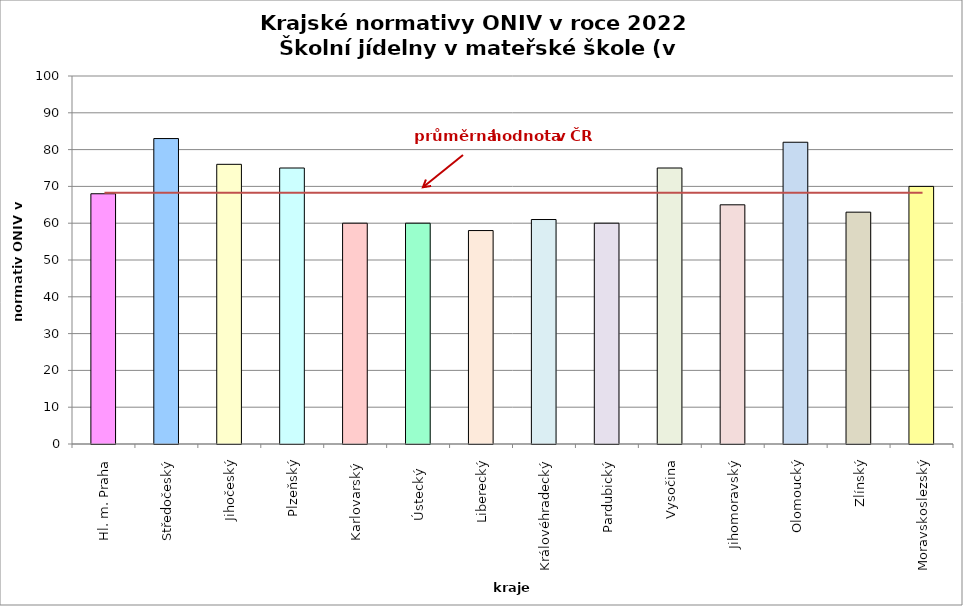
| Category | Series 0 |
|---|---|
| Hl. m. Praha | 68 |
| Středočeský | 83 |
| Jihočeský | 76 |
| Plzeňský | 75 |
| Karlovarský  | 60 |
| Ústecký   | 60 |
| Liberecký | 58 |
| Královéhradecký | 61 |
| Pardubický | 60 |
| Vysočina | 75 |
| Jihomoravský | 65 |
| Olomoucký | 82 |
| Zlínský | 63 |
| Moravskoslezský | 70 |